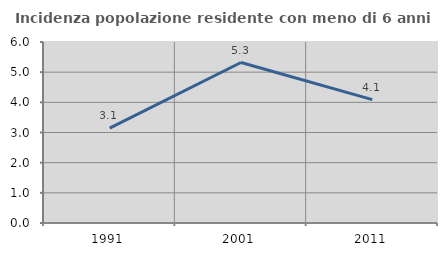
| Category | Incidenza popolazione residente con meno di 6 anni |
|---|---|
| 1991.0 | 3.147 |
| 2001.0 | 5.32 |
| 2011.0 | 4.091 |